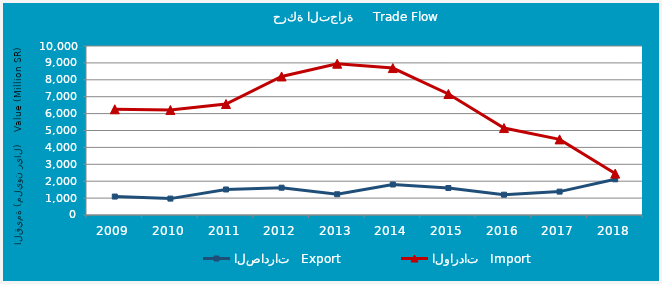
| Category | الصادرات   Export | الواردات   Import |
|---|---|---|
| 2009.0 | 1091219009 | 6256318863 |
| 2010.0 | 969893715 | 6215643520 |
| 2011.0 | 1509944865 | 6567281579 |
| 2012.0 | 1615620568 | 8198654597 |
| 2013.0 | 1227110284 | 8952255912 |
| 2014.0 | 1804432803 | 8694140592 |
| 2015.0 | 1595231805 | 7158951645 |
| 2016.0 | 1201677739 | 5144170015 |
| 2017.0 | 1383757715 | 4473881423 |
| 2018.0 | 2111787866 | 2450119436 |